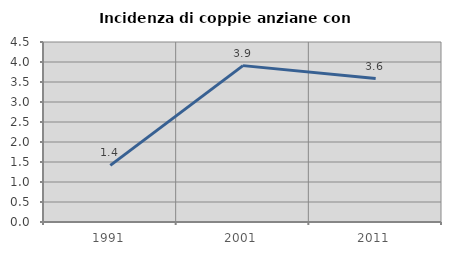
| Category | Incidenza di coppie anziane con figli |
|---|---|
| 1991.0 | 1.416 |
| 2001.0 | 3.909 |
| 2011.0 | 3.587 |